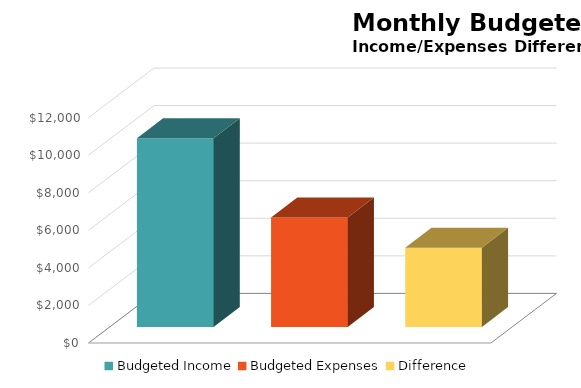
| Category | Series 0 |
|---|---|
| Budgeted Income | 10050 |
| Budgeted Expenses | 5828.5 |
| Difference | 4221.5 |